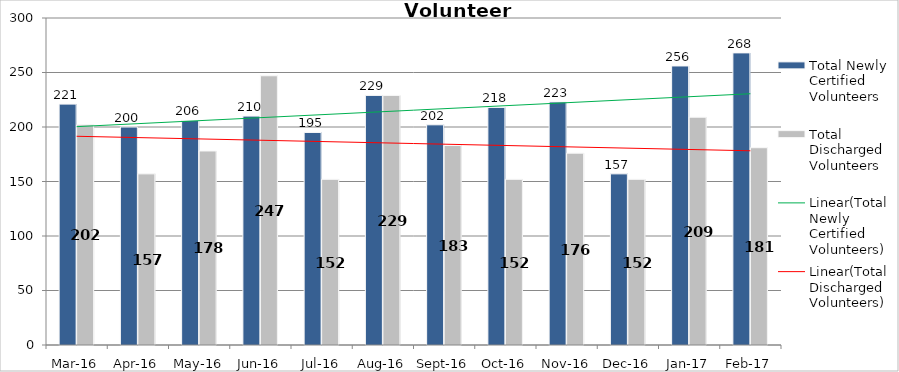
| Category | Total Newly Certified Volunteers | Total Discharged Volunteers |
|---|---|---|
| Mar-16 | 221 | 202 |
| Apr-16 | 200 | 157 |
| May-16 | 206 | 178 |
| Jun-16 | 210 | 247 |
| Jul-16 | 195 | 152 |
| Aug-16 | 229 | 229 |
| Sep-16 | 202 | 183 |
| Oct-16 | 218 | 152 |
| Nov-16 | 223 | 176 |
| Dec-16 | 157 | 152 |
| Jan-17 | 256 | 209 |
| Feb-17 | 268 | 181 |